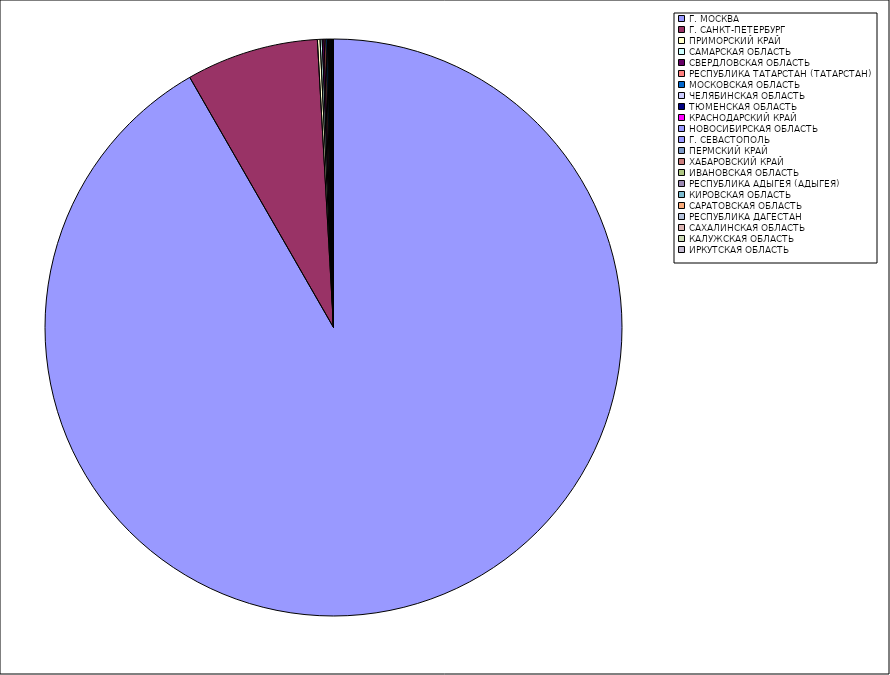
| Category | Оборот |
|---|---|
| Г. МОСКВА | 91.64 |
| Г. САНКТ-ПЕТЕРБУРГ | 7.404 |
| ПРИМОРСКИЙ КРАЙ | 0.152 |
| САМАРСКАЯ ОБЛАСТЬ | 0.113 |
| СВЕРДЛОВСКАЯ ОБЛАСТЬ | 0.107 |
| РЕСПУБЛИКА ТАТАРСТАН (ТАТАРСТАН) | 0.095 |
| МОСКОВСКАЯ ОБЛАСТЬ | 0.088 |
| ЧЕЛЯБИНСКАЯ ОБЛАСТЬ | 0.052 |
| ТЮМЕНСКАЯ ОБЛАСТЬ | 0.051 |
| КРАСНОДАРСКИЙ КРАЙ | 0.046 |
| НОВОСИБИРСКАЯ ОБЛАСТЬ | 0.035 |
| Г. СЕВАСТОПОЛЬ | 0.029 |
| ПЕРМСКИЙ КРАЙ | 0.021 |
| ХАБАРОВСКИЙ КРАЙ | 0.019 |
| ИВАНОВСКАЯ ОБЛАСТЬ | 0.019 |
| РЕСПУБЛИКА АДЫГЕЯ (АДЫГЕЯ) | 0.013 |
| КИРОВСКАЯ ОБЛАСТЬ | 0.011 |
| САРАТОВСКАЯ ОБЛАСТЬ | 0.01 |
| РЕСПУБЛИКА ДАГЕСТАН | 0.01 |
| САХАЛИНСКАЯ ОБЛАСТЬ | 0.008 |
| КАЛУЖСКАЯ ОБЛАСТЬ | 0.008 |
| ИРКУТСКАЯ ОБЛАСТЬ | 0.007 |